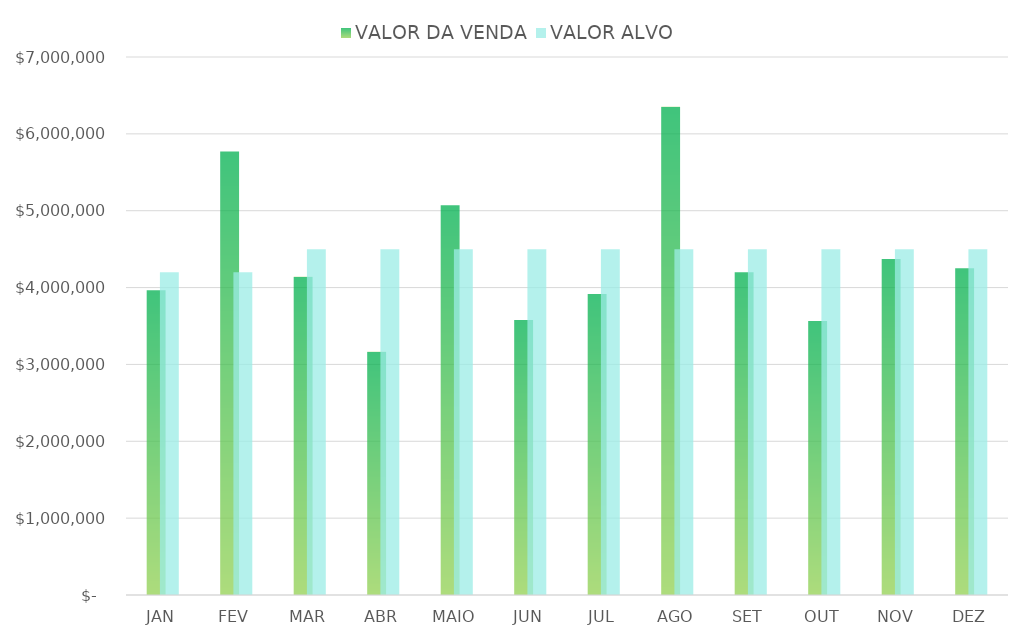
| Category | VALOR DA VENDA | VALOR ALVO |
|---|---|---|
| JAN | 3964785 | 4200000 |
| FEV | 5772041 | 4200000 |
| MAR | 4139699 | 4500000 |
| ABR | 3166287 | 4500000 |
| MAIO | 5072530 | 4500000 |
| JUN | 3577330 | 4500000 |
| JUL | 3916803 | 4500000 |
| AGO | 6352355 | 4500000 |
| SET | 4198802 | 4500000 |
| OUT | 3563537 | 4500000 |
| NOV | 4373343 | 4500000 |
| DEZ | 4250199 | 4500000 |